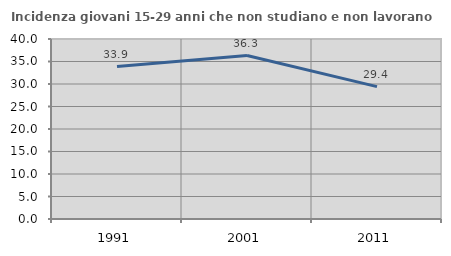
| Category | Incidenza giovani 15-29 anni che non studiano e non lavorano  |
|---|---|
| 1991.0 | 33.883 |
| 2001.0 | 36.325 |
| 2011.0 | 29.421 |